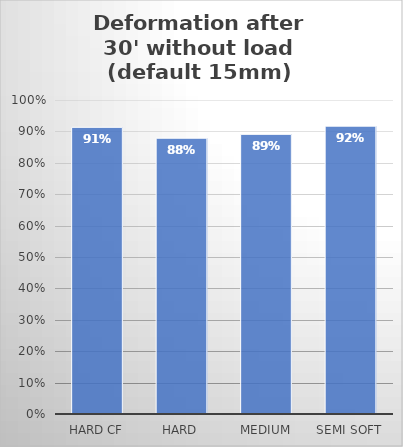
| Category | % |
|---|---|
| Hard CF | 0.913 |
| Hard | 0.878 |
| Medium | 0.891 |
| Semi soft | 0.917 |